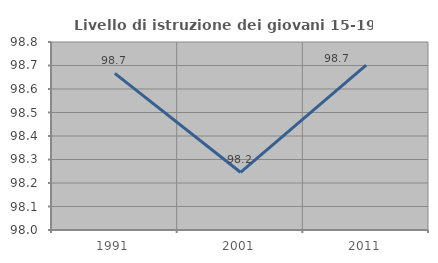
| Category | Livello di istruzione dei giovani 15-19 anni |
|---|---|
| 1991.0 | 98.667 |
| 2001.0 | 98.246 |
| 2011.0 | 98.701 |